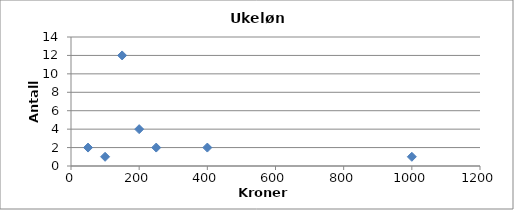
| Category | Series 0 |
|---|---|
| 50.0 | 2 |
| 100.0 | 1 |
| 150.0 | 12 |
| 200.0 | 4 |
| 250.0 | 2 |
| 400.0 | 2 |
| 1000.0 | 1 |